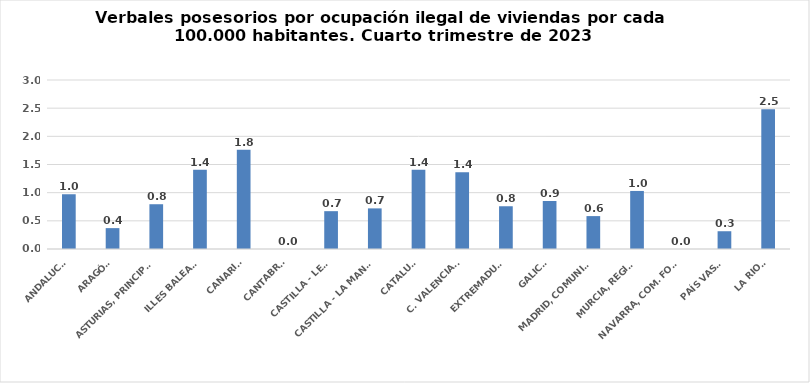
| Category | Series 0 |
|---|---|
| ANDALUCÍA | 0.972 |
| ARAGÓN | 0.371 |
| ASTURIAS, PRINCIPADO | 0.795 |
| ILLES BALEARS | 1.409 |
| CANARIAS | 1.762 |
| CANTABRIA | 0 |
| CASTILLA - LEÓN | 0.672 |
| CASTILLA - LA MANCHA | 0.721 |
| CATALUÑA | 1.405 |
| C. VALENCIANA | 1.361 |
| EXTREMADURA | 0.759 |
| GALICIA | 0.852 |
| MADRID, COMUNIDAD | 0.584 |
| MURCIA, REGIÓN | 1.03 |
| NAVARRA, COM. FORAL | 0 |
| PAÍS VASCO | 0.315 |
| LA RIOJA | 2.482 |